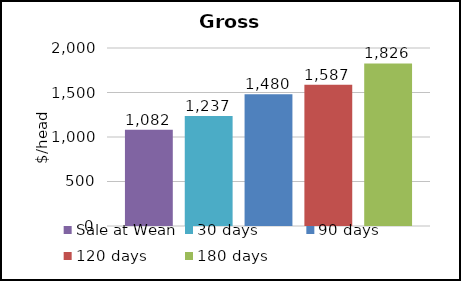
| Category | Sale at Wean | 30 days | 90 days | 120 days | 180 days |
|---|---|---|---|---|---|
| Backgrounding Gross Revenue ($/head) | 1081.575 | 1236.866 | 1480.142 | 1587.056 | 1826.064 |